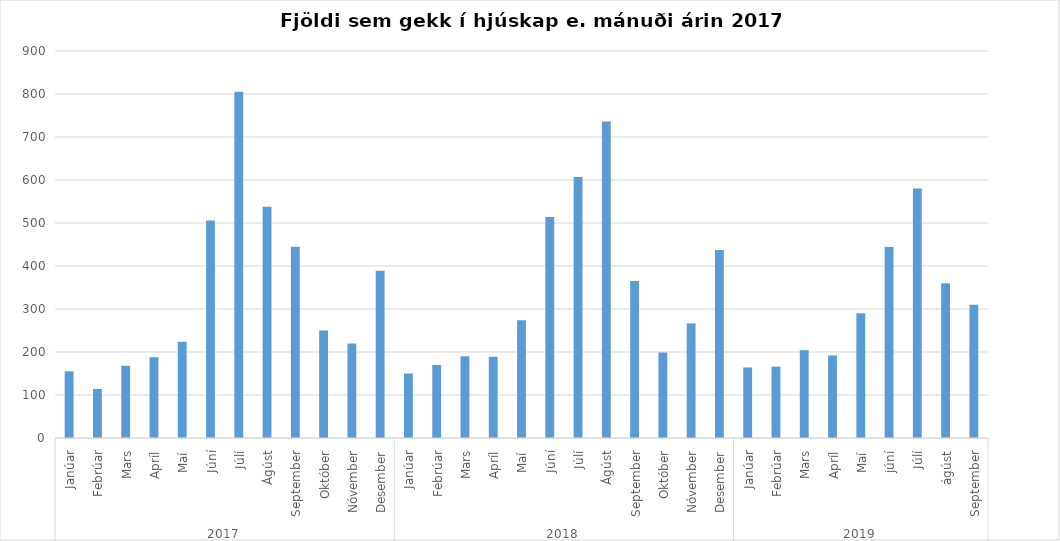
| Category | Series 0 |
|---|---|
| 0 | 155 |
| 1 | 114 |
| 2 | 168 |
| 3 | 188 |
| 4 | 224 |
| 5 | 506 |
| 6 | 805 |
| 7 | 538 |
| 8 | 445 |
| 9 | 250 |
| 10 | 220 |
| 11 | 389 |
| 12 | 150 |
| 13 | 170 |
| 14 | 190 |
| 15 | 189 |
| 16 | 274 |
| 17 | 514 |
| 18 | 607 |
| 19 | 736 |
| 20 | 365 |
| 21 | 199 |
| 22 | 266 |
| 23 | 437 |
| 24 | 164 |
| 25 | 166 |
| 26 | 204 |
| 27 | 192 |
| 28 | 290 |
| 29 | 444 |
| 30 | 580 |
| 31 | 360 |
| 32 | 310 |